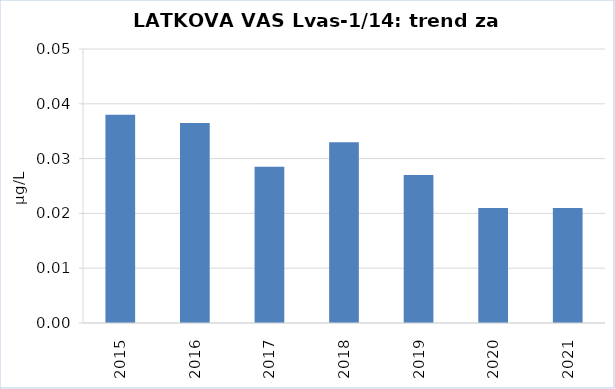
| Category | Vsota |
|---|---|
| 2015 | 0.038 |
| 2016 | 0.037 |
| 2017 | 0.028 |
| 2018 | 0.033 |
| 2019 | 0.027 |
| 2020 | 0.021 |
| 2021 | 0.021 |